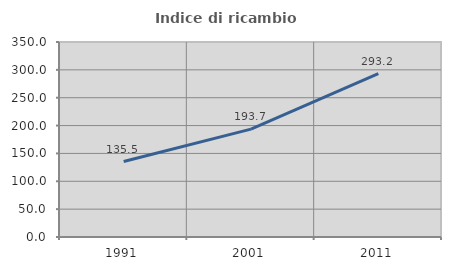
| Category | Indice di ricambio occupazionale  |
|---|---|
| 1991.0 | 135.461 |
| 2001.0 | 193.701 |
| 2011.0 | 293.249 |